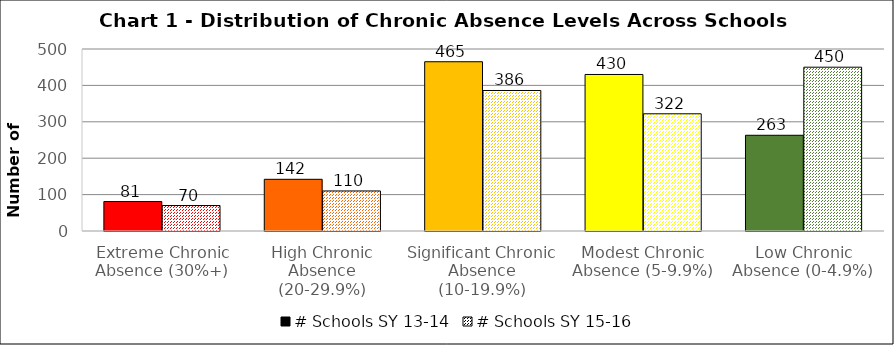
| Category | # Schools SY 13-14 | # Schools SY 15-16 |
|---|---|---|
| Extreme Chronic Absence (30%+) | 81 | 70 |
| High Chronic Absence (20-29.9%) | 142 | 110 |
| Significant Chronic Absence (10-19.9%) | 465 | 386 |
| Modest Chronic Absence (5-9.9%) | 430 | 322 |
| Low Chronic Absence (0-4.9%) | 263 | 450 |